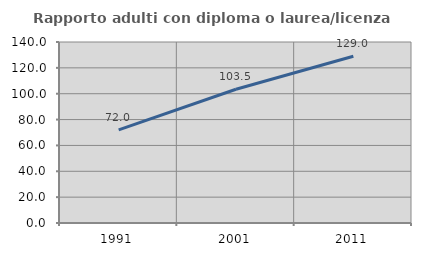
| Category | Rapporto adulti con diploma o laurea/licenza media  |
|---|---|
| 1991.0 | 71.991 |
| 2001.0 | 103.454 |
| 2011.0 | 128.959 |